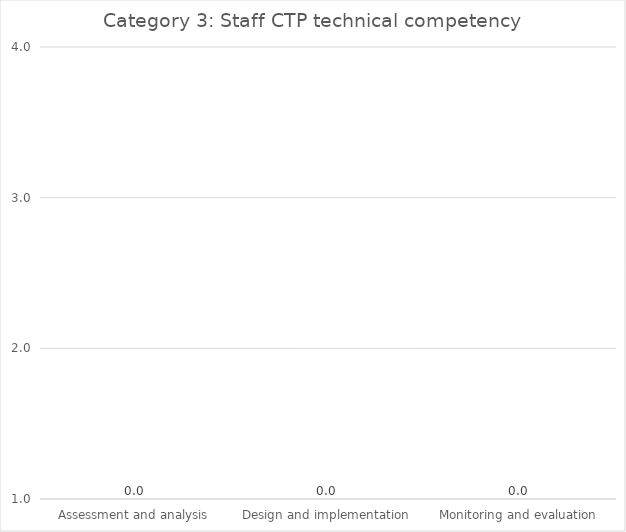
| Category |   Category 3: Staff CTP technical competency |
|---|---|
| Assessment and analysis | 0 |
| Design and implementation | 0 |
| Monitoring and evaluation | 0 |